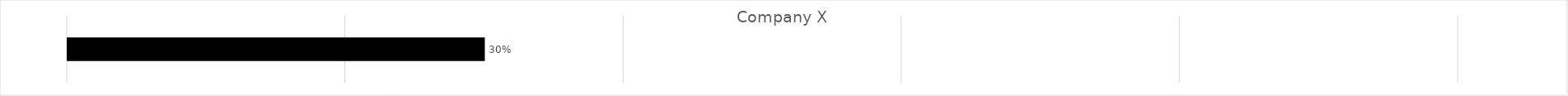
| Category | Company X |
|---|---|
| 0 | 0.3 |